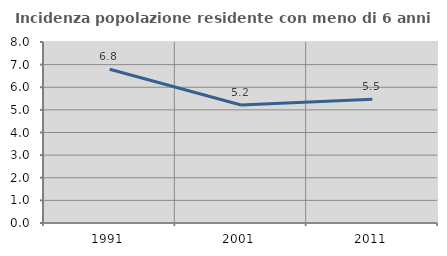
| Category | Incidenza popolazione residente con meno di 6 anni |
|---|---|
| 1991.0 | 6.792 |
| 2001.0 | 5.216 |
| 2011.0 | 5.47 |